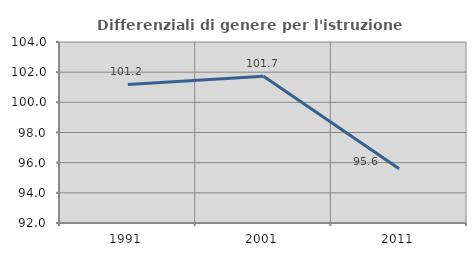
| Category | Differenziali di genere per l'istruzione superiore |
|---|---|
| 1991.0 | 101.19 |
| 2001.0 | 101.727 |
| 2011.0 | 95.601 |